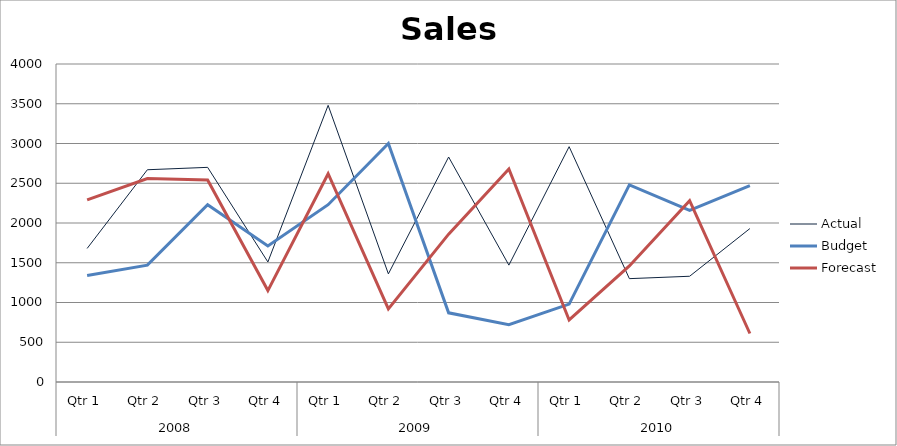
| Category | Actual | Budget | Forecast |
|---|---|---|---|
| 0 | 1680 | 1340 | 2290 |
| 1 | 2670 | 1470 | 2560 |
| 2 | 2700 | 2230 | 2540 |
| 3 | 1510 | 1710 | 1150 |
| 4 | 3480 | 2230 | 2620 |
| 5 | 1360 | 3000 | 920 |
| 6 | 2830 | 870 | 1860 |
| 7 | 1470 | 720 | 2680 |
| 8 | 2960 | 980 | 780 |
| 9 | 1300 | 2480 | 1460 |
| 10 | 1330 | 2160 | 2280 |
| 11 | 1930 | 2470 | 610 |